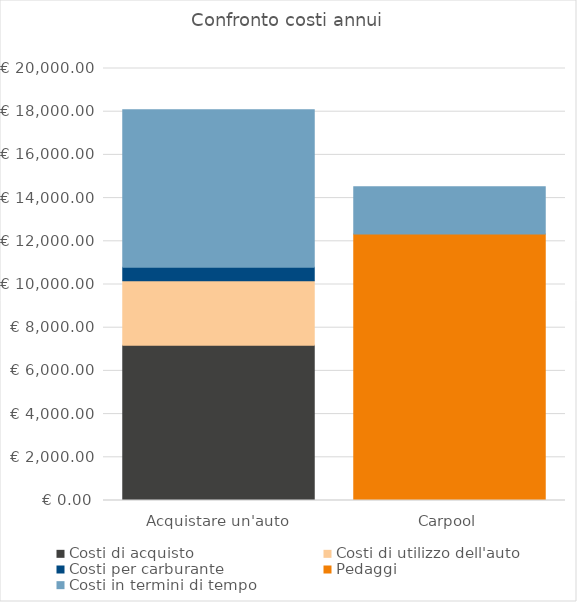
| Category | Costi di acquisto | Costi di utilizzo dell'auto | Costi per carburante | Pedaggi | Costi in termini di tempo |
|---|---|---|---|---|---|
| Acquistare un'auto | 7187.315 | 2990 | 617.692 | 0 | 7300 |
| Carpool | 0 | 0 | 0 | 12340.65 | 2190 |